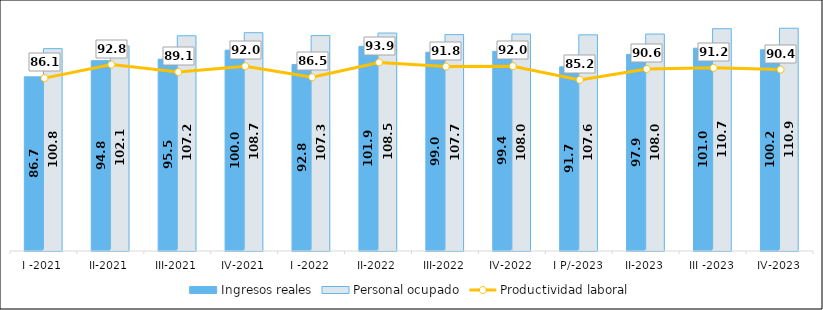
| Category | Ingresos reales | Personal ocupado |
|---|---|---|
| I -2021 | 86.727 | 100.763 |
| II-2021 | 94.778 | 102.099 |
| III-2021 | 95.512 | 107.174 |
| IV-2021 | 99.995 | 108.698 |
| I -2022 | 92.833 | 107.265 |
| II-2022 | 101.894 | 108.52 |
| III-2022 | 98.957 | 107.748 |
| IV-2022 | 99.417 | 108.023 |
| I P/-2023 | 91.69 | 107.622 |
| II-2023 | 97.912 | 108.028 |
| III -2023 | 100.963 | 110.695 |
| IV-2023 | 100.22 | 110.921 |